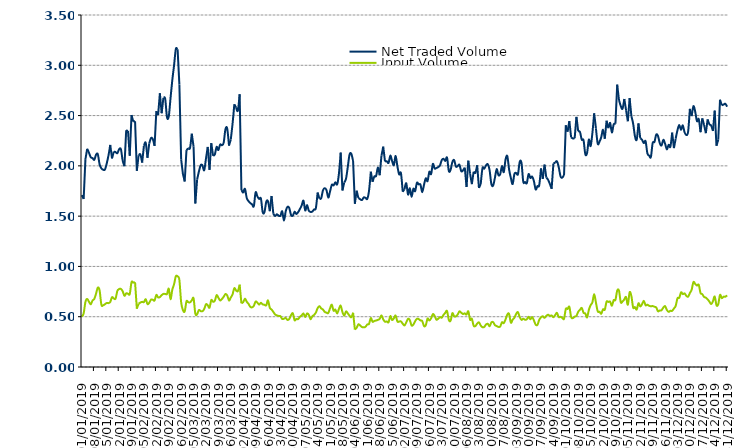
| Category | Net Traded Volume | Input Volume |
|---|---|---|
| 01/01/2019 | 1.709 | 0.501 |
| 02/01/2019 | 1.671 | 0.533 |
| 03/01/2019 | 2.067 | 0.647 |
| 04/01/2019 | 2.17 | 0.677 |
| 05/01/2019 | 2.13 | 0.648 |
| 06/01/2019 | 2.086 | 0.624 |
| 07/01/2019 | 2.077 | 0.66 |
| 08/01/2019 | 2.06 | 0.678 |
| 09/01/2019 | 2.111 | 0.73 |
| 10/01/2019 | 2.115 | 0.79 |
| 11/01/2019 | 2.014 | 0.76 |
| 12/01/2019 | 1.975 | 0.618 |
| 13/01/2019 | 1.962 | 0.614 |
| 14/01/2019 | 1.963 | 0.624 |
| 15/01/2019 | 2.023 | 0.637 |
| 16/01/2019 | 2.103 | 0.635 |
| 17/01/2019 | 2.208 | 0.647 |
| 18/01/2019 | 2.074 | 0.694 |
| 19/01/2019 | 2.142 | 0.682 |
| 20/01/2019 | 2.137 | 0.68 |
| 21/01/2019 | 2.126 | 0.756 |
| 22/01/2019 | 2.165 | 0.775 |
| 23/01/2019 | 2.166 | 0.777 |
| 24/01/2019 | 2.054 | 0.754 |
| 25/01/2019 | 1.997 | 0.708 |
| 26/01/2019 | 2.355 | 0.732 |
| 27/01/2019 | 2.346 | 0.73 |
| 28/01/2019 | 2.101 | 0.725 |
| 29/01/2019 | 2.505 | 0.844 |
| 30/01/2019 | 2.44 | 0.839 |
| 31/01/2019 | 2.444 | 0.843 |
| 01/02/2019 | 1.95 | 0.58 |
| 02/02/2019 | 2.105 | 0.629 |
| 03/02/2019 | 2.113 | 0.641 |
| 04/02/2019 | 2.032 | 0.648 |
| 05/02/2019 | 2.2 | 0.646 |
| 06/02/2019 | 2.229 | 0.674 |
| 07/02/2019 | 2.08 | 0.626 |
| 08/02/2019 | 2.224 | 0.639 |
| 09/02/2019 | 2.276 | 0.67 |
| 10/02/2019 | 2.266 | 0.669 |
| 11/02/2019 | 2.199 | 0.661 |
| 12/02/2019 | 2.544 | 0.717 |
| 13/02/2019 | 2.507 | 0.692 |
| 14/02/2019 | 2.722 | 0.696 |
| 15/02/2019 | 2.524 | 0.714 |
| 16/02/2019 | 2.677 | 0.727 |
| 17/02/2019 | 2.666 | 0.726 |
| 18/02/2019 | 2.485 | 0.725 |
| 19/02/2019 | 2.49 | 0.779 |
| 20/02/2019 | 2.672 | 0.674 |
| 21/02/2019 | 2.852 | 0.768 |
| 22/02/2019 | 3 | 0.823 |
| 23/02/2019 | 3.161 | 0.902 |
| 24/02/2019 | 3.158 | 0.9 |
| 25/02/2019 | 2.807 | 0.865 |
| 26/02/2019 | 2.064 | 0.644 |
| 27/02/2019 | 1.919 | 0.566 |
| 28/02/2019 | 1.845 | 0.552 |
| 01/03/2019 | 2.156 | 0.653 |
| 02/03/2019 | 2.175 | 0.644 |
| 03/03/2019 | 2.178 | 0.643 |
| 04/03/2019 | 2.32 | 0.662 |
| 05/03/2019 | 2.192 | 0.683 |
| 06/03/2019 | 1.626 | 0.53 |
| 07/03/2019 | 1.863 | 0.524 |
| 08/03/2019 | 1.943 | 0.566 |
| 09/03/2019 | 2.006 | 0.556 |
| 10/03/2019 | 2.005 | 0.555 |
| 11/03/2019 | 1.956 | 0.577 |
| 12/03/2019 | 2.072 | 0.624 |
| 13/03/2019 | 2.188 | 0.614 |
| 14/03/2019 | 1.96 | 0.589 |
| 15/03/2019 | 2.226 | 0.666 |
| 16/03/2019 | 2.1 | 0.649 |
| 17/03/2019 | 2.114 | 0.659 |
| 18/03/2019 | 2.188 | 0.714 |
| 19/03/2019 | 2.157 | 0.689 |
| 20/03/2019 | 2.212 | 0.661 |
| 21/03/2019 | 2.205 | 0.676 |
| 22/03/2019 | 2.231 | 0.698 |
| 23/03/2019 | 2.366 | 0.725 |
| 24/03/2019 | 2.369 | 0.711 |
| 25/03/2019 | 2.201 | 0.662 |
| 26/03/2019 | 2.262 | 0.691 |
| 27/03/2019 | 2.419 | 0.722 |
| 28/03/2019 | 2.612 | 0.784 |
| 29/03/2019 | 2.58 | 0.761 |
| 30/03/2019 | 2.549 | 0.755 |
| 31/03/2019 | 2.712 | 0.819 |
| 01/04/2019 | 1.76 | 0.633 |
| 02/04/2019 | 1.729 | 0.645 |
| 03/04/2019 | 1.771 | 0.68 |
| 04/04/2019 | 1.68 | 0.649 |
| 05/04/2019 | 1.65 | 0.628 |
| 06/04/2019 | 1.63 | 0.598 |
| 07/04/2019 | 1.617 | 0.593 |
| 08/04/2019 | 1.599 | 0.608 |
| 09/04/2019 | 1.736 | 0.651 |
| 10/04/2019 | 1.696 | 0.639 |
| 11/04/2019 | 1.671 | 0.62 |
| 12/04/2019 | 1.675 | 0.639 |
| 13/04/2019 | 1.54 | 0.623 |
| 14/04/2019 | 1.539 | 0.619 |
| 15/04/2019 | 1.642 | 0.613 |
| 16/04/2019 | 1.648 | 0.663 |
| 17/04/2019 | 1.549 | 0.589 |
| 18/04/2019 | 1.701 | 0.572 |
| 19/04/2019 | 1.524 | 0.548 |
| 20/04/2019 | 1.501 | 0.523 |
| 21/04/2019 | 1.518 | 0.513 |
| 22/04/2019 | 1.505 | 0.508 |
| 23/04/2019 | 1.503 | 0.505 |
| 24/04/2019 | 1.548 | 0.477 |
| 25/04/2019 | 1.455 | 0.48 |
| 26/04/2019 | 1.549 | 0.487 |
| 27/04/2019 | 1.593 | 0.468 |
| 28/04/2019 | 1.58 | 0.478 |
| 29/04/2019 | 1.511 | 0.515 |
| 30/04/2019 | 1.505 | 0.534 |
| 01/05/2019 | 1.544 | 0.465 |
| 02/05/2019 | 1.521 | 0.478 |
| 03/05/2019 | 1.54 | 0.476 |
| 04/05/2019 | 1.571 | 0.499 |
| 05/05/2019 | 1.607 | 0.513 |
| 06/05/2019 | 1.654 | 0.532 |
| 07/05/2019 | 1.556 | 0.497 |
| 08/05/2019 | 1.61 | 0.532 |
| 09/05/2019 | 1.555 | 0.518 |
| 10/05/2019 | 1.542 | 0.475 |
| 11/05/2019 | 1.546 | 0.504 |
| 12/05/2019 | 1.566 | 0.518 |
| 13/05/2019 | 1.581 | 0.542 |
| 14/05/2019 | 1.735 | 0.586 |
| 15/05/2019 | 1.674 | 0.605 |
| 16/05/2019 | 1.678 | 0.583 |
| 17/05/2019 | 1.756 | 0.571 |
| 18/05/2019 | 1.779 | 0.548 |
| 19/05/2019 | 1.758 | 0.54 |
| 20/05/2019 | 1.684 | 0.536 |
| 21/05/2019 | 1.746 | 0.584 |
| 22/05/2019 | 1.812 | 0.62 |
| 23/05/2019 | 1.806 | 0.559 |
| 24/05/2019 | 1.837 | 0.571 |
| 25/05/2019 | 1.816 | 0.532 |
| 26/05/2019 | 1.921 | 0.577 |
| 27/05/2019 | 2.132 | 0.611 |
| 28/05/2019 | 1.755 | 0.545 |
| 29/05/2019 | 1.834 | 0.51 |
| 30/05/2019 | 1.871 | 0.552 |
| 31/05/2019 | 1.988 | 0.533 |
| 01/06/2019 | 2.113 | 0.511 |
| 02/06/2019 | 2.12 | 0.495 |
| 03/06/2019 | 2.048 | 0.54 |
| 04/06/2019 | 1.623 | 0.372 |
| 05/06/2019 | 1.753 | 0.39 |
| 06/06/2019 | 1.68 | 0.424 |
| 07/06/2019 | 1.668 | 0.413 |
| 08/06/2019 | 1.66 | 0.398 |
| 09/06/2019 | 1.686 | 0.394 |
| 10/06/2019 | 1.682 | 0.4 |
| 11/06/2019 | 1.672 | 0.423 |
| 12/06/2019 | 1.754 | 0.429 |
| 13/06/2019 | 1.942 | 0.486 |
| 14/06/2019 | 1.842 | 0.449 |
| 15/06/2019 | 1.895 | 0.458 |
| 16/06/2019 | 1.899 | 0.462 |
| 17/06/2019 | 1.984 | 0.469 |
| 18/06/2019 | 1.907 | 0.479 |
| 19/06/2019 | 2.1 | 0.513 |
| 20/06/2019 | 2.191 | 0.473 |
| 21/06/2019 | 2.044 | 0.45 |
| 22/06/2019 | 2.046 | 0.454 |
| 23/06/2019 | 2.029 | 0.445 |
| 24/06/2019 | 2.102 | 0.507 |
| 25/06/2019 | 2.048 | 0.467 |
| 26/06/2019 | 2.007 | 0.484 |
| 27/06/2019 | 2.099 | 0.512 |
| 28/06/2019 | 1.994 | 0.452 |
| 29/06/2019 | 1.915 | 0.452 |
| 30/06/2019 | 1.927 | 0.453 |
| 01/07/2019 | 1.743 | 0.431 |
| 02/07/2019 | 1.768 | 0.413 |
| 03/07/2019 | 1.826 | 0.444 |
| 04/07/2019 | 1.714 | 0.479 |
| 05/07/2019 | 1.777 | 0.466 |
| 06/07/2019 | 1.692 | 0.413 |
| 07/07/2019 | 1.772 | 0.422 |
| 08/07/2019 | 1.748 | 0.455 |
| 09/07/2019 | 1.832 | 0.48 |
| 10/07/2019 | 1.816 | 0.477 |
| 11/07/2019 | 1.814 | 0.463 |
| 12/07/2019 | 1.738 | 0.457 |
| 13/07/2019 | 1.811 | 0.407 |
| 14/07/2019 | 1.876 | 0.415 |
| 15/07/2019 | 1.848 | 0.482 |
| 16/07/2019 | 1.941 | 0.463 |
| 17/07/2019 | 1.918 | 0.483 |
| 18/07/2019 | 2.019 | 0.525 |
| 19/07/2019 | 1.974 | 0.508 |
| 20/07/2019 | 1.979 | 0.471 |
| 21/07/2019 | 1.988 | 0.48 |
| 22/07/2019 | 2.004 | 0.496 |
| 23/07/2019 | 2.056 | 0.49 |
| 24/07/2019 | 2.07 | 0.518 |
| 25/07/2019 | 2.049 | 0.539 |
| 26/07/2019 | 2.082 | 0.557 |
| 27/07/2019 | 1.949 | 0.468 |
| 28/07/2019 | 1.961 | 0.46 |
| 29/07/2019 | 2.038 | 0.535 |
| 30/07/2019 | 2.058 | 0.504 |
| 31/07/2019 | 1.994 | 0.503 |
| 01/08/2019 | 1.998 | 0.522 |
| 02/08/2019 | 2.011 | 0.553 |
| 03/08/2019 | 1.948 | 0.54 |
| 04/08/2019 | 1.955 | 0.527 |
| 05/08/2019 | 1.982 | 0.534 |
| 06/08/2019 | 1.79 | 0.521 |
| 07/08/2019 | 2.052 | 0.554 |
| 08/08/2019 | 1.922 | 0.47 |
| 09/08/2019 | 1.818 | 0.48 |
| 10/08/2019 | 1.941 | 0.411 |
| 11/08/2019 | 1.931 | 0.407 |
| 12/08/2019 | 2.006 | 0.432 |
| 13/08/2019 | 1.781 | 0.444 |
| 14/08/2019 | 1.819 | 0.413 |
| 15/08/2019 | 1.977 | 0.396 |
| 16/08/2019 | 1.973 | 0.398 |
| 17/08/2019 | 2.005 | 0.423 |
| 18/08/2019 | 2.016 | 0.429 |
| 19/08/2019 | 1.957 | 0.405 |
| 20/08/2019 | 1.82 | 0.443 |
| 21/08/2019 | 1.804 | 0.446 |
| 22/08/2019 | 1.88 | 0.417 |
| 23/08/2019 | 1.968 | 0.407 |
| 24/08/2019 | 1.907 | 0.398 |
| 25/08/2019 | 1.918 | 0.403 |
| 26/08/2019 | 1.997 | 0.445 |
| 27/08/2019 | 1.938 | 0.436 |
| 28/08/2019 | 2.063 | 0.473 |
| 29/08/2019 | 2.097 | 0.521 |
| 30/08/2019 | 1.965 | 0.528 |
| 31/08/2019 | 1.88 | 0.441 |
| 01/09/2019 | 1.819 | 0.47 |
| 02/09/2019 | 1.919 | 0.49 |
| 03/09/2019 | 1.929 | 0.528 |
| 04/09/2019 | 1.917 | 0.545 |
| 05/09/2019 | 2.039 | 0.497 |
| 06/09/2019 | 2.03 | 0.469 |
| 07/09/2019 | 1.842 | 0.48 |
| 08/09/2019 | 1.839 | 0.47 |
| 09/09/2019 | 1.828 | 0.474 |
| 10/09/2019 | 1.918 | 0.499 |
| 11/09/2019 | 1.88 | 0.475 |
| 12/09/2019 | 1.893 | 0.498 |
| 13/09/2019 | 1.848 | 0.463 |
| 14/09/2019 | 1.765 | 0.421 |
| 15/09/2019 | 1.798 | 0.419 |
| 16/09/2019 | 1.807 | 0.469 |
| 17/09/2019 | 1.974 | 0.494 |
| 18/09/2019 | 1.87 | 0.505 |
| 19/09/2019 | 2.013 | 0.488 |
| 20/09/2019 | 1.883 | 0.509 |
| 21/09/2019 | 1.862 | 0.52 |
| 22/09/2019 | 1.82 | 0.508 |
| 23/09/2019 | 1.772 | 0.512 |
| 24/09/2019 | 2.022 | 0.495 |
| 25/09/2019 | 2.033 | 0.516 |
| 26/09/2019 | 2.045 | 0.538 |
| 27/09/2019 | 1.988 | 0.496 |
| 28/09/2019 | 1.897 | 0.499 |
| 29/09/2019 | 1.883 | 0.488 |
| 30/09/2019 | 1.91 | 0.48 |
| 01/10/2019 | 2.403 | 0.577 |
| 02/10/2019 | 2.339 | 0.577 |
| 03/10/2019 | 2.445 | 0.598 |
| 04/10/2019 | 2.284 | 0.497 |
| 05/10/2019 | 2.272 | 0.487 |
| 06/10/2019 | 2.276 | 0.501 |
| 07/10/2019 | 2.487 | 0.508 |
| 08/10/2019 | 2.345 | 0.549 |
| 09/10/2019 | 2.337 | 0.569 |
| 10/10/2019 | 2.26 | 0.587 |
| 11/10/2019 | 2.255 | 0.539 |
| 12/10/2019 | 2.117 | 0.532 |
| 13/10/2019 | 2.128 | 0.493 |
| 14/10/2019 | 2.262 | 0.568 |
| 15/10/2019 | 2.197 | 0.615 |
| 16/10/2019 | 2.326 | 0.643 |
| 17/10/2019 | 2.522 | 0.725 |
| 18/10/2019 | 2.372 | 0.641 |
| 19/10/2019 | 2.221 | 0.554 |
| 20/10/2019 | 2.24 | 0.55 |
| 21/10/2019 | 2.285 | 0.53 |
| 22/10/2019 | 2.358 | 0.574 |
| 23/10/2019 | 2.27 | 0.57 |
| 24/10/2019 | 2.449 | 0.65 |
| 25/10/2019 | 2.375 | 0.647 |
| 26/10/2019 | 2.427 | 0.65 |
| 27/10/2019 | 2.332 | 0.609 |
| 28/10/2019 | 2.412 | 0.664 |
| 29/10/2019 | 2.418 | 0.667 |
| 30/10/2019 | 2.808 | 0.759 |
| 31/10/2019 | 2.654 | 0.76 |
| 01/11/2019 | 2.595 | 0.645 |
| 02/11/2019 | 2.568 | 0.651 |
| 03/11/2019 | 2.665 | 0.672 |
| 04/11/2019 | 2.553 | 0.695 |
| 05/11/2019 | 2.444 | 0.619 |
| 06/11/2019 | 2.674 | 0.743 |
| 07/11/2019 | 2.494 | 0.705 |
| 08/11/2019 | 2.419 | 0.591 |
| 09/11/2019 | 2.295 | 0.596 |
| 10/11/2019 | 2.261 | 0.571 |
| 11/11/2019 | 2.422 | 0.634 |
| 12/11/2019 | 2.274 | 0.602 |
| 13/11/2019 | 2.26 | 0.624 |
| 14/11/2019 | 2.226 | 0.658 |
| 15/11/2019 | 2.245 | 0.614 |
| 16/11/2019 | 2.126 | 0.62 |
| 17/11/2019 | 2.102 | 0.609 |
| 18/11/2019 | 2.089 | 0.604 |
| 19/11/2019 | 2.227 | 0.606 |
| 20/11/2019 | 2.238 | 0.599 |
| 21/11/2019 | 2.31 | 0.592 |
| 22/11/2019 | 2.297 | 0.554 |
| 23/11/2019 | 2.227 | 0.562 |
| 24/11/2019 | 2.203 | 0.564 |
| 25/11/2019 | 2.259 | 0.591 |
| 26/11/2019 | 2.221 | 0.605 |
| 27/11/2019 | 2.164 | 0.568 |
| 28/11/2019 | 2.208 | 0.548 |
| 29/11/2019 | 2.191 | 0.559 |
| 30/11/2019 | 2.33 | 0.558 |
| 01/12/2019 | 2.176 | 0.582 |
| 02/12/2019 | 2.272 | 0.609 |
| 03/12/2019 | 2.356 | 0.684 |
| 04/12/2019 | 2.407 | 0.688 |
| 05/12/2019 | 2.358 | 0.742 |
| 06/12/2019 | 2.402 | 0.725 |
| 07/12/2019 | 2.334 | 0.732 |
| 08/12/2019 | 2.306 | 0.708 |
| 09/12/2019 | 2.341 | 0.699 |
| 10/12/2019 | 2.567 | 0.735 |
| 11/12/2019 | 2.495 | 0.769 |
| 12/12/2019 | 2.593 | 0.844 |
| 13/12/2019 | 2.539 | 0.826 |
| 14/12/2019 | 2.444 | 0.81 |
| 15/12/2019 | 2.465 | 0.817 |
| 16/12/2019 | 2.335 | 0.736 |
| 17/12/2019 | 2.473 | 0.724 |
| 18/12/2019 | 2.408 | 0.697 |
| 19/12/2019 | 2.325 | 0.689 |
| 20/12/2019 | 2.462 | 0.673 |
| 21/12/2019 | 2.414 | 0.65 |
| 22/12/2019 | 2.401 | 0.626 |
| 23/12/2019 | 2.347 | 0.654 |
| 24/12/2019 | 2.549 | 0.702 |
| 25/12/2019 | 2.2 | 0.614 |
| 26/12/2019 | 2.259 | 0.625 |
| 27/12/2019 | 2.658 | 0.717 |
| 28/12/2019 | 2.603 | 0.685 |
| 29/12/2019 | 2.609 | 0.699 |
| 30/12/2019 | 2.618 | 0.699 |
| 31/12/2019 | 2.588 | 0.712 |